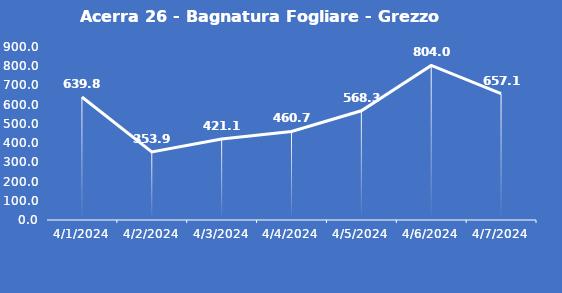
| Category | Acerra 26 - Bagnatura Fogliare - Grezzo (min) |
|---|---|
| 4/1/24 | 639.8 |
| 4/2/24 | 353.9 |
| 4/3/24 | 421.1 |
| 4/4/24 | 460.7 |
| 4/5/24 | 568.3 |
| 4/6/24 | 804 |
| 4/7/24 | 657.1 |